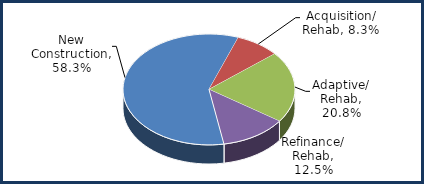
| Category | Series 0 |
|---|---|
| New Construction | 0.583 |
| Acquisition/ Rehab | 0.083 |
| Adaptive/ Rehab | 0.208 |
| Refinance/ Rehab | 0.125 |